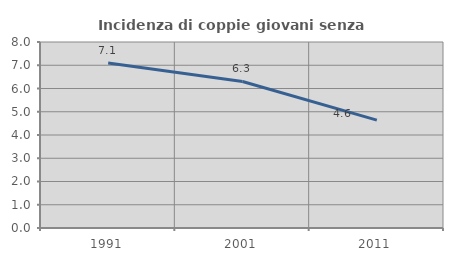
| Category | Incidenza di coppie giovani senza figli |
|---|---|
| 1991.0 | 7.094 |
| 2001.0 | 6.304 |
| 2011.0 | 4.638 |